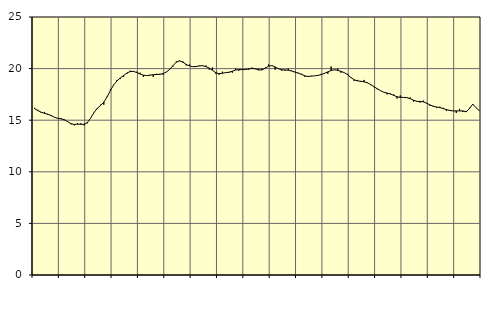
| Category | Piggar | Series 1 |
|---|---|---|
| nan | 16.2 | 16.11 |
| 87.0 | 16 | 15.93 |
| 87.0 | 15.7 | 15.77 |
| 87.0 | 15.8 | 15.67 |
| nan | 15.5 | 15.58 |
| 88.0 | 15.5 | 15.44 |
| 88.0 | 15.3 | 15.29 |
| 88.0 | 15.2 | 15.18 |
| nan | 15.2 | 15.13 |
| 89.0 | 15 | 15.05 |
| 89.0 | 14.9 | 14.87 |
| 89.0 | 14.6 | 14.67 |
| nan | 14.5 | 14.59 |
| 90.0 | 14.7 | 14.61 |
| 90.0 | 14.7 | 14.61 |
| 90.0 | 14.5 | 14.6 |
| nan | 14.7 | 14.77 |
| 91.0 | 15.2 | 15.2 |
| 91.0 | 15.7 | 15.73 |
| 91.0 | 16.1 | 16.15 |
| nan | 16.5 | 16.42 |
| 92.0 | 16.5 | 16.75 |
| 92.0 | 17.3 | 17.26 |
| 92.0 | 18 | 17.88 |
| nan | 18.4 | 18.42 |
| 93.0 | 18.9 | 18.81 |
| 93.0 | 19 | 19.09 |
| 93.0 | 19.2 | 19.33 |
| nan | 19.5 | 19.57 |
| 94.0 | 19.8 | 19.71 |
| 94.0 | 19.7 | 19.73 |
| 94.0 | 19.7 | 19.62 |
| nan | 19.6 | 19.48 |
| 95.0 | 19.2 | 19.36 |
| 95.0 | 19.3 | 19.32 |
| 95.0 | 19.4 | 19.36 |
| nan | 19.2 | 19.41 |
| 96.0 | 19.5 | 19.43 |
| 96.0 | 19.5 | 19.44 |
| 96.0 | 19.4 | 19.52 |
| nan | 19.7 | 19.67 |
| 97.0 | 19.9 | 19.93 |
| 97.0 | 20.2 | 20.28 |
| 97.0 | 20.7 | 20.62 |
| nan | 20.8 | 20.75 |
| 98.0 | 20.7 | 20.62 |
| 98.0 | 20.3 | 20.41 |
| 98.0 | 20.4 | 20.26 |
| nan | 20.2 | 20.19 |
| 99.0 | 20.2 | 20.2 |
| 99.0 | 20.3 | 20.26 |
| 99.0 | 20.3 | 20.28 |
| nan | 20.3 | 20.19 |
| 0.0 | 19.9 | 20.05 |
| 0.0 | 20.1 | 19.83 |
| 0.0 | 19.5 | 19.6 |
| nan | 19.4 | 19.51 |
| 1.0 | 19.7 | 19.55 |
| 1.0 | 19.6 | 19.61 |
| 1.0 | 19.6 | 19.65 |
| nan | 19.6 | 19.74 |
| 2.0 | 20 | 19.86 |
| 2.0 | 19.8 | 19.9 |
| 2.0 | 19.9 | 19.9 |
| nan | 19.9 | 19.92 |
| 3.0 | 19.9 | 19.97 |
| 3.0 | 20.1 | 20.02 |
| 3.0 | 20 | 19.97 |
| nan | 20 | 19.87 |
| 4.0 | 20 | 19.87 |
| 4.0 | 20.1 | 20.04 |
| 4.0 | 20.4 | 20.24 |
| nan | 20.3 | 20.29 |
| 5.0 | 19.9 | 20.16 |
| 5.0 | 20 | 19.99 |
| 5.0 | 19.8 | 19.89 |
| nan | 19.8 | 19.87 |
| 6.0 | 20 | 19.85 |
| 6.0 | 19.8 | 19.77 |
| 6.0 | 19.7 | 19.66 |
| nan | 19.6 | 19.56 |
| 7.0 | 19.5 | 19.44 |
| 7.0 | 19.2 | 19.3 |
| 7.0 | 19.2 | 19.24 |
| nan | 19.3 | 19.27 |
| 8.0 | 19.3 | 19.3 |
| 8.0 | 19.3 | 19.34 |
| 8.0 | 19.5 | 19.42 |
| nan | 19.5 | 19.54 |
| 9.0 | 19.5 | 19.68 |
| 9.0 | 20.2 | 19.82 |
| 9.0 | 19.9 | 19.88 |
| nan | 20 | 19.83 |
| 10.0 | 19.6 | 19.73 |
| 10.0 | 19.6 | 19.61 |
| 10.0 | 19.5 | 19.41 |
| nan | 19.1 | 19.14 |
| 11.0 | 18.8 | 18.92 |
| 11.0 | 18.9 | 18.81 |
| 11.0 | 18.7 | 18.77 |
| nan | 18.9 | 18.72 |
| 12.0 | 18.6 | 18.63 |
| 12.0 | 18.4 | 18.46 |
| 12.0 | 18.2 | 18.25 |
| nan | 18 | 18.05 |
| 13.0 | 17.9 | 17.86 |
| 13.0 | 17.7 | 17.71 |
| 13.0 | 17.5 | 17.63 |
| nan | 17.6 | 17.54 |
| 14.0 | 17.5 | 17.41 |
| 14.0 | 17.1 | 17.27 |
| 14.0 | 17.4 | 17.21 |
| nan | 17.2 | 17.21 |
| 15.0 | 17.2 | 17.19 |
| 15.0 | 17.2 | 17.09 |
| 15.0 | 16.8 | 16.94 |
| nan | 16.8 | 16.83 |
| 16.0 | 16.7 | 16.82 |
| 16.0 | 16.9 | 16.78 |
| 16.0 | 16.6 | 16.65 |
| nan | 16.4 | 16.48 |
| 17.0 | 16.4 | 16.34 |
| 17.0 | 16.2 | 16.28 |
| 17.0 | 16.3 | 16.23 |
| nan | 16.2 | 16.13 |
| 18.0 | 15.9 | 16.03 |
| 18.0 | 16 | 15.94 |
| 18.0 | 15.9 | 15.9 |
| nan | 15.7 | 15.9 |
| 19.0 | 16.1 | 15.9 |
| 19.0 | 15.8 | 15.9 |
| 19.0 | 15.9 | 15.81 |
| nan | 16.2 | 16.12 |
| 20.0 | 16.5 | 16.56 |
| 20.0 | 16.2 | 16.2 |
| 20.0 | 15.9 | 15.92 |